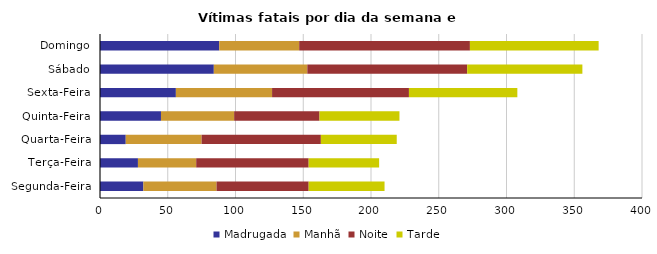
| Category | Madrugada | Manhã | Noite | Tarde |
|---|---|---|---|---|
| Segunda-Feira | 32 | 54 | 68 | 56 |
| Terça-Feira | 28 | 43 | 83 | 52 |
| Quarta-Feira | 19 | 56 | 88 | 56 |
| Quinta-Feira | 45 | 54 | 63 | 59 |
| Sexta-Feira | 56 | 71 | 101 | 80 |
| Sábado | 84 | 69 | 118 | 85 |
| Domingo | 88 | 59 | 126 | 95 |